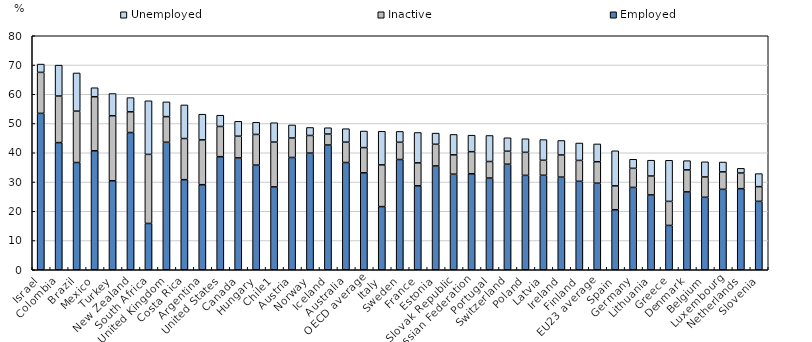
| Category | Employed | Inactive | Unemployed |
|---|---|---|---|
| Israel | 53.47 | 14.01 | 2.84 |
| Colombia | 43.477 | 15.915 | 10.56 |
| Brazil | 36.667 | 17.551 | 13.066 |
| Mexico | 40.672 | 18.484 | 3.075 |
| Turkey | 30.413 | 22.242 | 7.596 |
| New Zealand | 46.908 | 7.083 | 4.858 |
| South Africa | 15.833 | 23.613 | 18.322 |
| United Kingdom | 43.587 | 8.766 | 5.044 |
| Costa Rica | 30.799 | 14.065 | 11.493 |
| Argentina | 29.077 | 15.327 | 8.781 |
| United States | 38.652 | 10.338 | 3.851 |
| Canada | 38.239 | 7.421 | 5.094 |
| Hungary | 35.773 | 10.491 | 4.152 |
| Chile1 | 28.333 | 15.31 | 6.629 |
| Austria | 38.384 | 6.653 | 4.464 |
| Norway | 39.884 | 6.019 | 2.741 |
| Iceland | 42.647 | 3.75 | 2.16 |
| Australia | 36.671 | 6.961 | 4.591 |
| OECD average | 33.135 | 8.631 | 5.661 |
| Italy | 21.594 | 14.261 | 11.482 |
| Sweden | 37.689 | 5.895 | 3.717 |
| France | 28.701 | 7.841 | 10.39 |
| Estonia | 35.491 | 7.406 | 3.822 |
| Slovak Republic | 32.672 | 6.613 | 6.985 |
| Russian Federation | 32.82 | 7.559 | 5.626 |
| Portugal | 31.355 | 5.65 | 8.899 |
| Switzerland | 36.084 | 4.433 | 4.603 |
| Poland | 32.271 | 7.871 | 4.648 |
| Latvia | 32.299 | 5.131 | 7.067 |
| Ireland | 31.663 | 7.581 | 4.955 |
| Finland | 30.238 | 7.143 | 5.952 |
| EU23 average | 29.597 | 7.34 | 6.085 |
| Spain | 20.52 | 8.161 | 11.991 |
| Germany | 28.144 | 6.525 | 3.101 |
| Lithuania | 25.588 | 6.458 | 5.409 |
| Greece | 15.156 | 8.223 | 14.044 |
| Denmark | 26.614 | 7.531 | 3.147 |
| Belgium | 24.78 | 6.95 | 5.181 |
| Luxembourg | 27.496 | 5.979 | 3.354 |
| Netherlands | 27.728 | 5.345 | 1.597 |
| Slovenia | 23.397 | 5.012 | 4.457 |